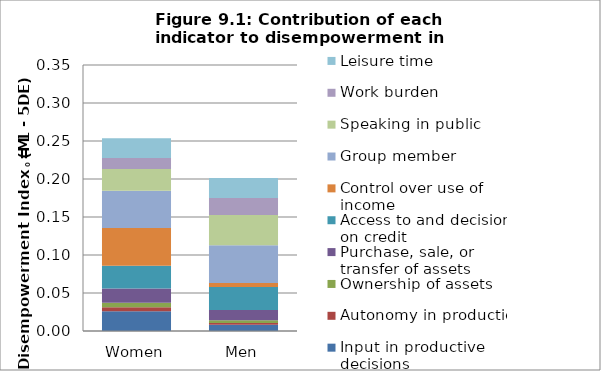
| Category | Input in productive decisions | Autonomy in production | Ownership of assets | Purchase, sale, or transfer of assets | Access to and decisions on credit | Control over use of income | Group member | Speaking in public | Work burden | Leisure time |
|---|---|---|---|---|---|---|---|---|---|---|
| Women | 0.026 | 0.005 | 0.006 | 0.019 | 0.03 | 0.05 | 0.049 | 0.028 | 0.015 | 0.026 |
| Men | 0.008 | 0.002 | 0.004 | 0.013 | 0.03 | 0.005 | 0.049 | 0.04 | 0.022 | 0.026 |